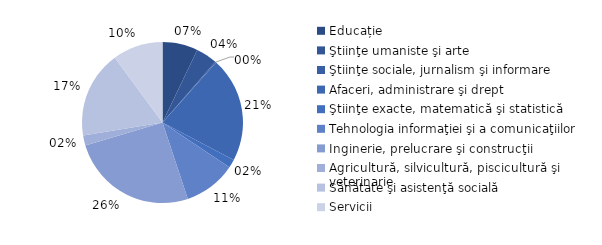
| Category | Series 0 |
|---|---|
| Educație | 7.1 |
| Ştiinţe umaniste şi arte | 4.3 |
| Ştiinţe sociale, jurnalism şi informare | 0.2 |
| Afaceri, administrare şi drept | 21.1 |
| Ştiinţe exacte, matematică şi statistică | 1.7 |
| Tehnologia informaţiei şi a comunicaţiilor | 10.5 |
| Inginerie, prelucrare şi construcţii | 25.5 |
| Agricultură, silvicultură, piscicultură şi veterinarie | 2 |
| Sănătate şi asistenţă socială | 17.5 |
| Servicii | 10.1 |